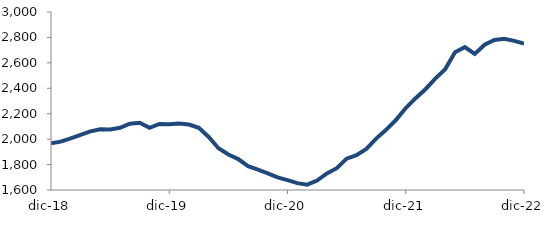
| Category | Series 0 |
|---|---|
| 2018-12-01 | 1967.481 |
| 2019-01-01 | 1980.122 |
| 2019-02-01 | 2005.664 |
| 2019-03-01 | 2033.637 |
| 2019-04-01 | 2060.76 |
| 2019-05-01 | 2078.07 |
| 2019-06-01 | 2076.377 |
| 2019-07-01 | 2089.152 |
| 2019-08-01 | 2121.901 |
| 2019-09-01 | 2128.491 |
| 2019-10-01 | 2088.553 |
| 2019-11-01 | 2119.211 |
| 2019-12-01 | 2116.27 |
| 2020-01-01 | 2123.179 |
| 2020-02-01 | 2115.217 |
| 2020-03-01 | 2088.6 |
| 2020-04-01 | 2017.241 |
| 2020-05-01 | 1928.116 |
| 2020-06-01 | 1878.979 |
| 2020-07-01 | 1843.29 |
| 2020-08-01 | 1787.543 |
| 2020-09-01 | 1760.281 |
| 2020-10-01 | 1731.197 |
| 2020-11-01 | 1698.835 |
| 2020-12-01 | 1677.184 |
| 2021-01-01 | 1654.072 |
| 2021-02-01 | 1641.869 |
| 2021-03-01 | 1673.821 |
| 2021-04-01 | 1730.759 |
| 2021-05-01 | 1771.425 |
| 2021-06-01 | 1846.573 |
| 2021-07-01 | 1874.111 |
| 2021-08-01 | 1922.894 |
| 2021-09-01 | 2004.225 |
| 2021-10-01 | 2073.331 |
| 2021-11-01 | 2150.314 |
| 2021-12-01 | 2244.492 |
| 2022-01-01 | 2321.95 |
| 2022-02-01 | 2392.65 |
| 2022-03-01 | 2476.383 |
| 2022-04-01 | 2549.069 |
| 2022-05-01 | 2683.336 |
| 2022-06-01 | 2723.868 |
| 2022-07-01 | 2670.585 |
| 2022-08-01 | 2742.913 |
| 2022-09-01 | 2780.46 |
| 2022-10-01 | 2788.916 |
| 2022-11-01 | 2772.628 |
| 2022-12-01 | 2752.307 |